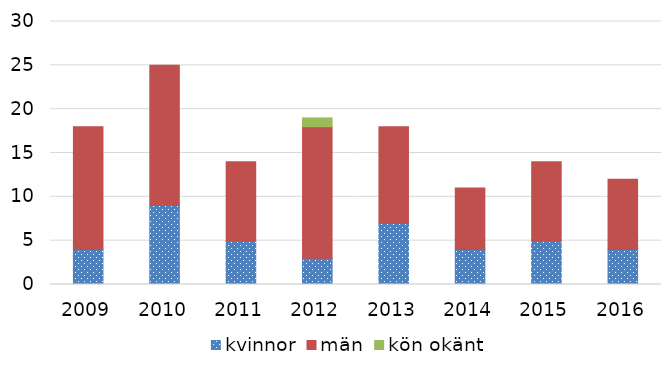
| Category | kvinnor | män | kön okänt |
|---|---|---|---|
| 2009 | 4 | 14 | 0 |
| 2010 | 9 | 16 | 0 |
| 2011 | 5 | 9 | 0 |
| 2012 | 3 | 15 | 1 |
| 2013 | 7 | 11 | 0 |
| 2014 | 4 | 7 | 0 |
| 2015 | 5 | 9 | 0 |
| 2016 | 4 | 8 | 0 |